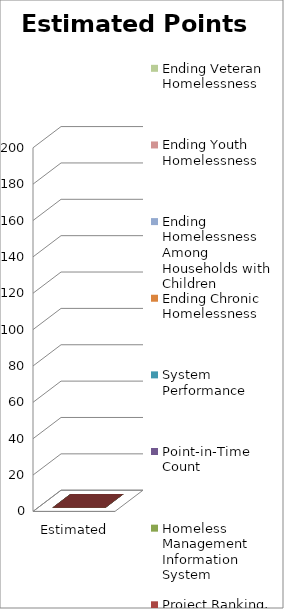
| Category | CoC Coordination and Engagement | Project Ranking, Review, and Capacity | Homeless Management Information System | Point-in-Time Count | System Performance | Ending Chronic Homelessness | Ending Homelessness Among Households with Children | Ending Youth Homelessness | Ending Veteran Homelessness |
|---|---|---|---|---|---|---|---|---|---|
| Estimated Points | 0 | 0 | 0 | 0 | 0 | 0 | 0 | 0 | 0 |